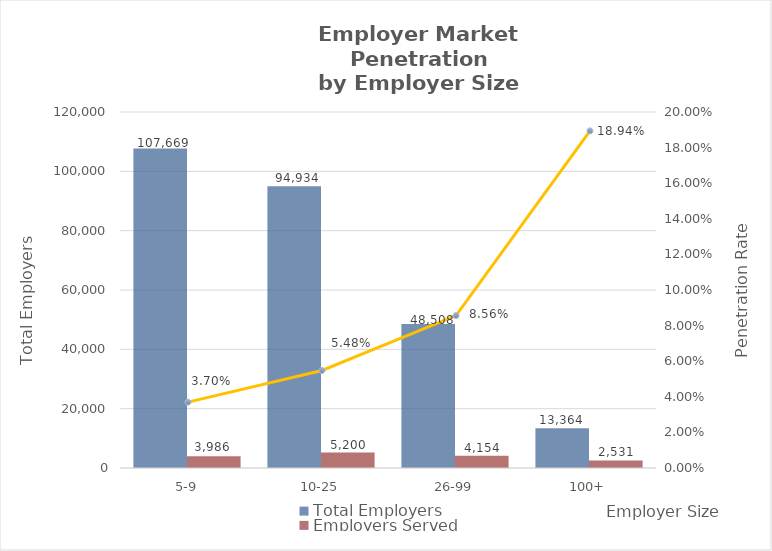
| Category | Total Employers | Employers Served |
|---|---|---|
| 5-9 | 107669 | 3986 |
| 10-25 | 94934 | 5200 |
| 26-99 | 48508 | 4154 |
| 100+ | 13364 | 2531 |